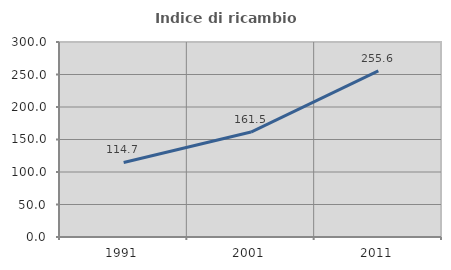
| Category | Indice di ricambio occupazionale  |
|---|---|
| 1991.0 | 114.706 |
| 2001.0 | 161.462 |
| 2011.0 | 255.569 |